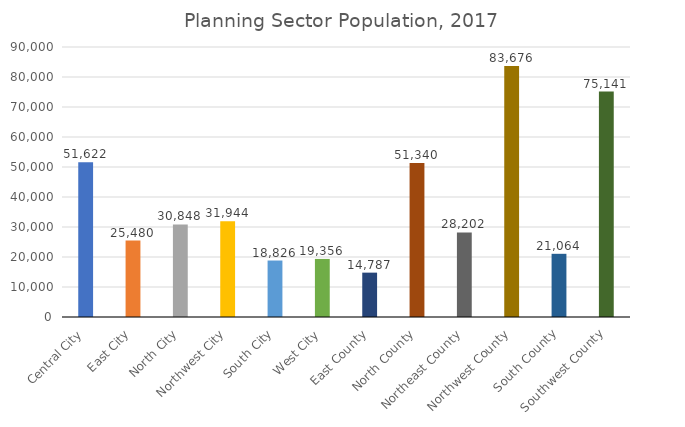
| Category | Total population |
|---|---|
| Central City | 51622 |
| East City | 25480 |
| North City | 30848 |
| Northwest City | 31944 |
| South City | 18826 |
| West City | 19356 |
| East County | 14787 |
| North County | 51340 |
| Northeast County | 28202 |
| Northwest County | 83676 |
| South County | 21064 |
| Southwest County | 75141 |